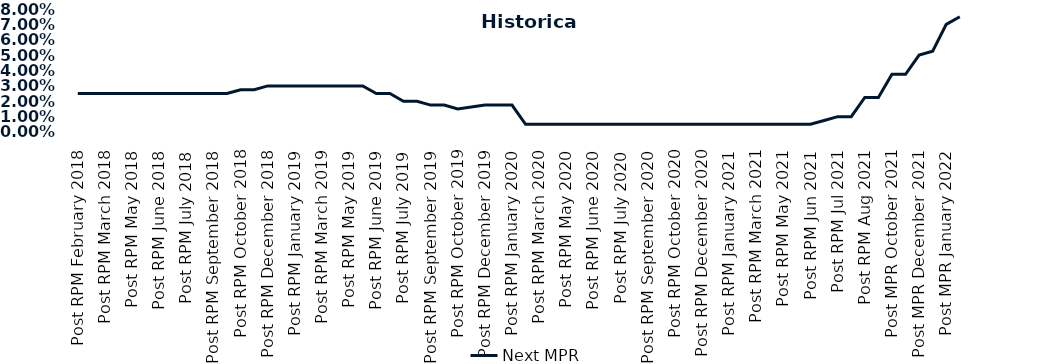
| Category | Next MPR |
|---|---|
| Post RPM February 2018 | 0.025 |
| Pre RPM March 2018 | 0.025 |
| Post RPM March 2018 | 0.025 |
| Pre RPM May 2018 | 0.025 |
| Post RPM May 2018 | 0.025 |
| Pre RPM June 2018 | 0.025 |
| Post RPM June 2018 | 0.025 |
| Pre RPM July 2018 | 0.025 |
| Post RPM July 2018 | 0.025 |
| Pre RPM September 2018 | 0.025 |
| Post RPM September 2018 | 0.025 |
| Pre RPM October 2018 | 0.025 |
| Post RPM October 2018 | 0.028 |
| Pre RPM December 2018 | 0.028 |
| Post RPM December 2018 | 0.03 |
| Pre RPM January 2019 | 0.03 |
| Post RPM January 2019 | 0.03 |
| Pre RPM March 2019 | 0.03 |
| Post RPM March 2019 | 0.03 |
| Pre RPM May 2019 | 0.03 |
| Post RPM May 2019 | 0.03 |
| Pre RPM June 2019 | 0.03 |
| Post RPM June 2019 | 0.025 |
| Pre RPM July 2019 | 0.025 |
| Post RPM July 2019 | 0.02 |
| Pre RPM September 2019 | 0.02 |
| Post RPM September 2019 | 0.018 |
| Pre RPM October 2019 | 0.018 |
| Post RPM October 2019 | 0.015 |
| Pre RPM December 2019 | 0.016 |
| Post RPM December 2019 | 0.018 |
| Pre RPM January 2020 | 0.018 |
| Post RPM January 2020 | 0.018 |
| Pre RPM March 2020 | 0.005 |
| Post RPM March 2020 | 0.005 |
| Pre RPM May 2020 | 0.005 |
| Post RPM May 2020 | 0.005 |
| Pre RPM June 2020 | 0.005 |
| Post RPM June 2020 | 0.005 |
| Pre RPM July 2020 | 0.005 |
| Post RPM July 2020 | 0.005 |
| Pre RPM September 2020 | 0.005 |
| Post RPM September 2020 | 0.005 |
| Pre RPM October 2020 | 0.005 |
| Post RPM October 2020 | 0.005 |
| Pre RPM December 2020 | 0.005 |
|  Post RPM December 2020 | 0.005 |
| Pre RPM January 2021 | 0.005 |
| Post RPM January 2021 | 0.005 |
|  Pre RPM March 2021 | 0.005 |
|  Post RPM March 2021 | 0.005 |
|  Pre RPM May 2021 | 0.005 |
|  Post RPM May 2021 | 0.005 |
|  Pre RPM Jun 2021 | 0.005 |
|   Post RPM Jun 2021 | 0.005 |
| Pre RPM Jul 2021 | 0.008 |
|  Post RPM Jul 2021 | 0.01 |
| Pre RPM Aug 2021 | 0.01 |
|  Post RPM Aug 2021 | 0.022 |
| Pre MPR October 2021 | 0.022 |
| Post MPR October 2021 | 0.038 |
| Pre MPR December 2021 | 0.038 |
| Post MPR December 2021 | 0.05 |
| Pre MPR January 2022 | 0.052 |
| Post MPR January 2022 | 0.07 |
| Pre MPR March 2022 | 0.075 |